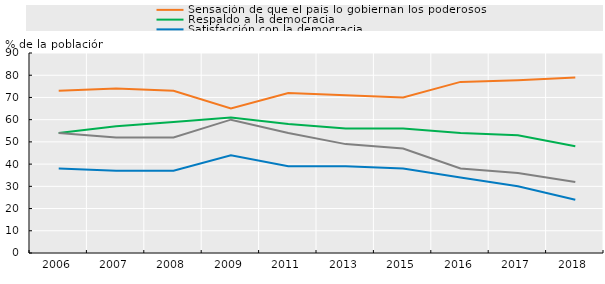
| Category | Sensación de que el país lo gobiernan los poderosos | Respaldo a la democracia | Satisfacción con la democracia | Aprobación del Gobierno |
|---|---|---|---|---|
| 2006.0 | 73 | 54 | 38 | 54 |
| 2007.0 | 74 | 57 | 37 | 52 |
| 2008.0 | 73 | 59 | 37 | 52 |
| 2009.0 | 65 | 61 | 44 | 60 |
| 2011.0 | 72 | 58 | 39 | 54 |
| 2013.0 | 71 | 56 | 39 | 49 |
| 2015.0 | 70 | 56 | 38 | 47 |
| 2016.0 | 77 | 54 | 34 | 38 |
| 2017.0 | 77.773 | 53 | 30 | 36 |
| 2018.0 | 79 | 48 | 24 | 32 |